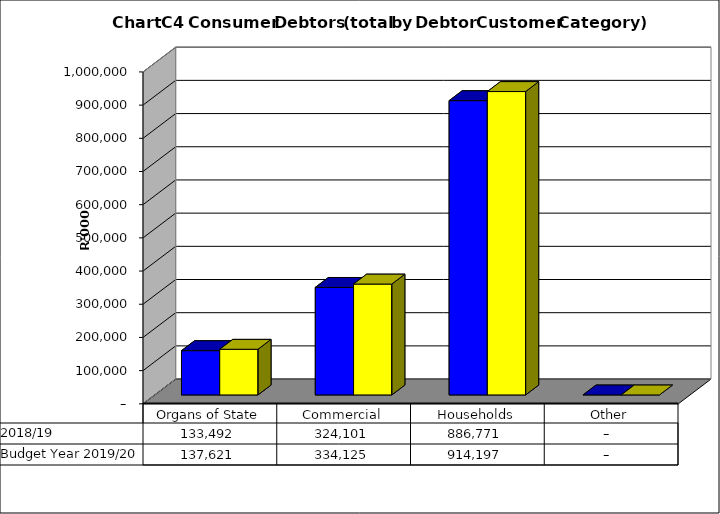
| Category |  2018/19  | Budget Year 2019/20 |
|---|---|---|
| Organs of State | 133492150.78 | 137620774 |
| Commercial | 324101078.31 | 334124823 |
| Households | 886771116.19 | 914197027 |
| Other | 0 | 0 |